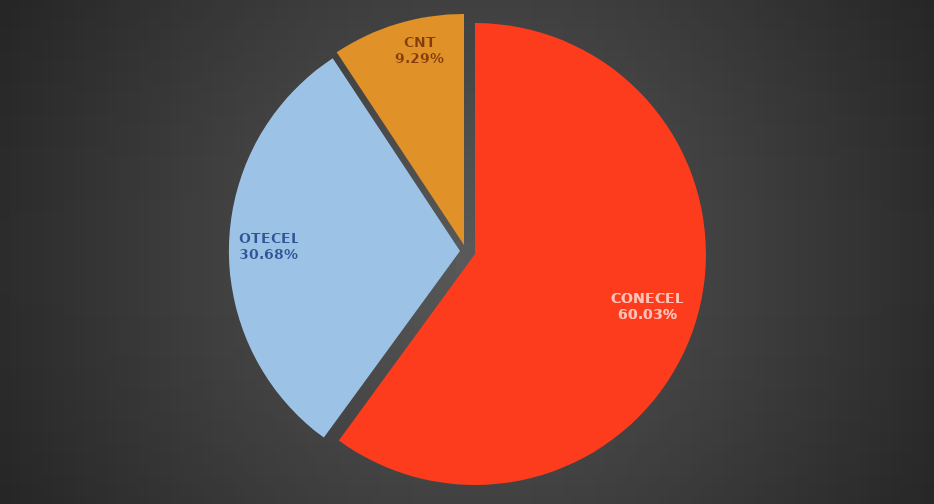
| Category | Sep2016 |
|---|---|
| CONECEL | 8929127 |
| OTECEL | 4563659 |
| CNT | 1381589 |